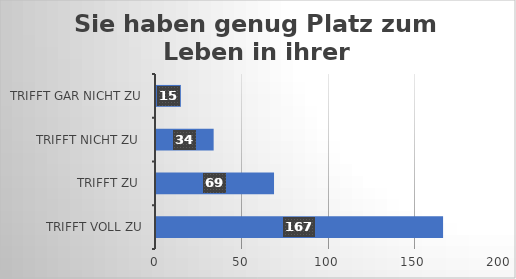
| Category | Sie haben genug Platz zum Leben in ihrer Wohnung/Haus.  |
|---|---|
| trifft voll zu | 167 |
| trifft zu  | 69 |
| trifft nicht zu  | 34 |
| trifft gar nicht zu | 15 |